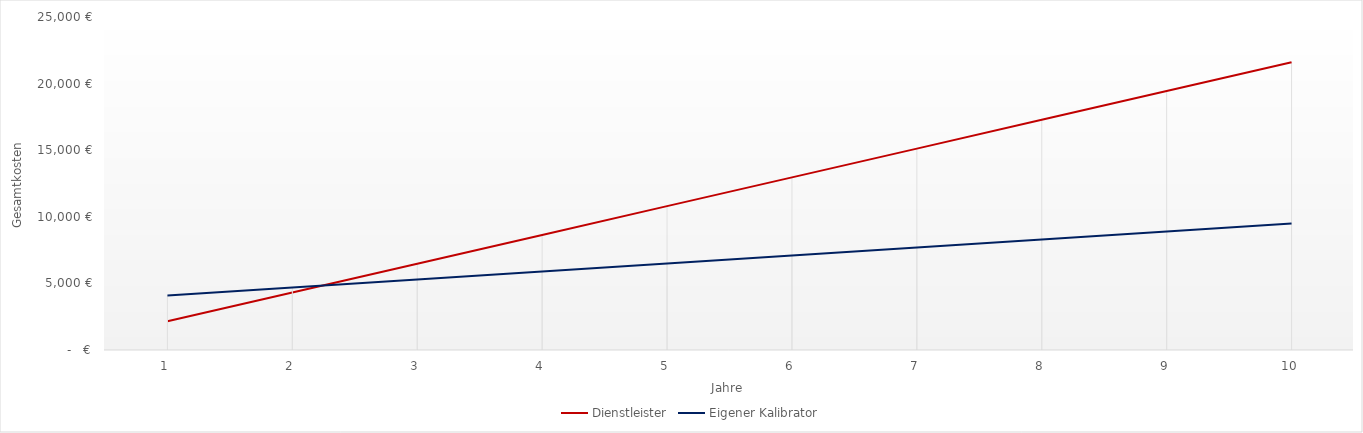
| Category | Dienstleister | Eigener Kalibrator |
|---|---|---|
| 0 | 2160 | 4100 |
| 1 | 4320 | 4700 |
| 2 | 6480 | 5300 |
| 3 | 8640 | 5900 |
| 4 | 10800 | 6500 |
| 5 | 12960 | 7100 |
| 6 | 15120 | 7700 |
| 7 | 17280 | 8300 |
| 8 | 19440 | 8900 |
| 9 | 21600 | 9500 |